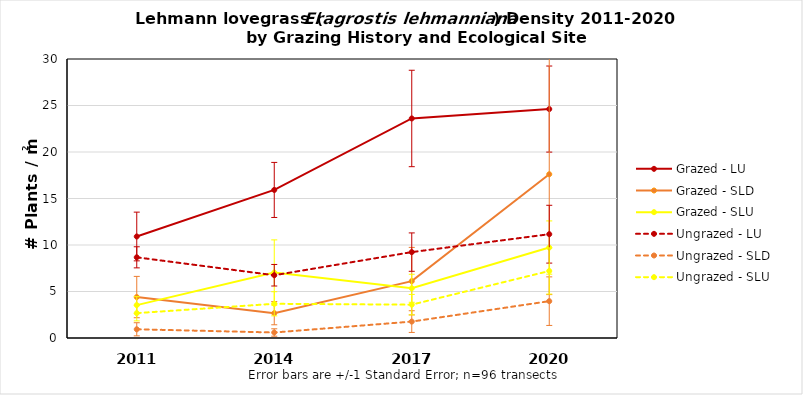
| Category | Grazed - LU | Grazed - SLD | Grazed - SLU | Ungrazed - LU | Ungrazed - SLD | Ungrazed - SLU |
|---|---|---|---|---|---|---|
| 2011.0 | 10.915 | 4.402 | 3.538 | 8.676 | 0.936 | 2.674 |
| 2014.0 | 15.92 | 2.669 | 7.04 | 6.749 | 0.592 | 3.678 |
| 2017.0 | 23.605 | 6.114 | 5.347 | 9.235 | 1.765 | 3.585 |
| 2020.0 | 24.617 | 17.61 | 9.725 | 11.162 | 3.961 | 7.206 |